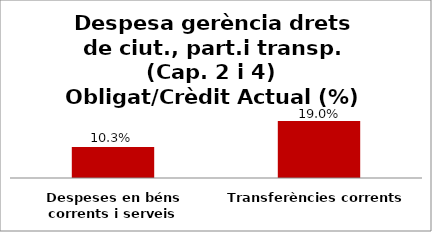
| Category | Series 0 |
|---|---|
| Despeses en béns corrents i serveis | 0.103 |
| Transferències corrents | 0.19 |